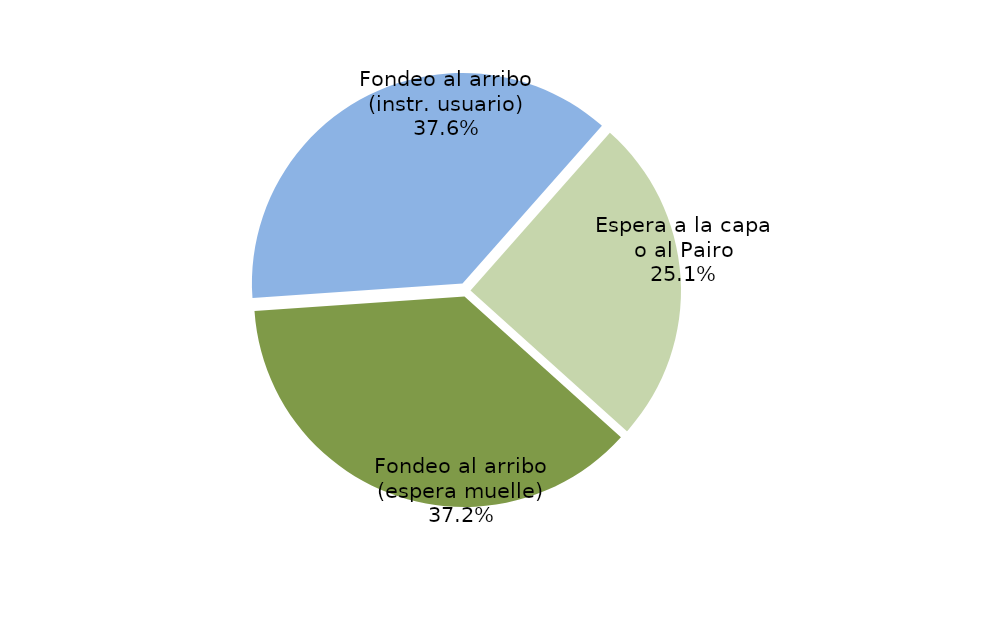
| Category | Series 0 |
|---|---|
| Fondeo al arribo (espera muelle) | 15923.867 |
| Fondeo al arribo (instr. usuario) | 16078.917 |
| Espera a la capa o al Pairo | 10751.917 |